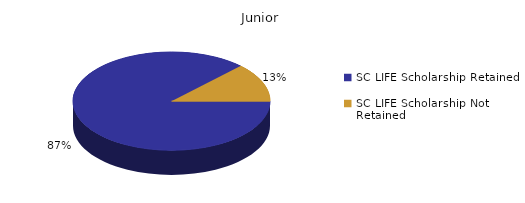
| Category | Junior |
|---|---|
| SC LIFE Scholarship Retained  | 1367 |
| SC LIFE Scholarship Not Retained  | 198 |